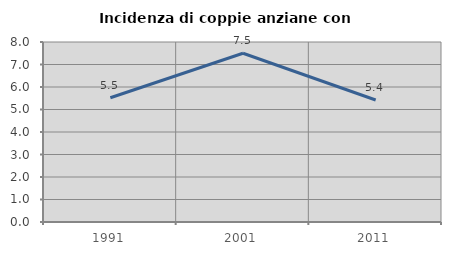
| Category | Incidenza di coppie anziane con figli |
|---|---|
| 1991.0 | 5.521 |
| 2001.0 | 7.5 |
| 2011.0 | 5.422 |